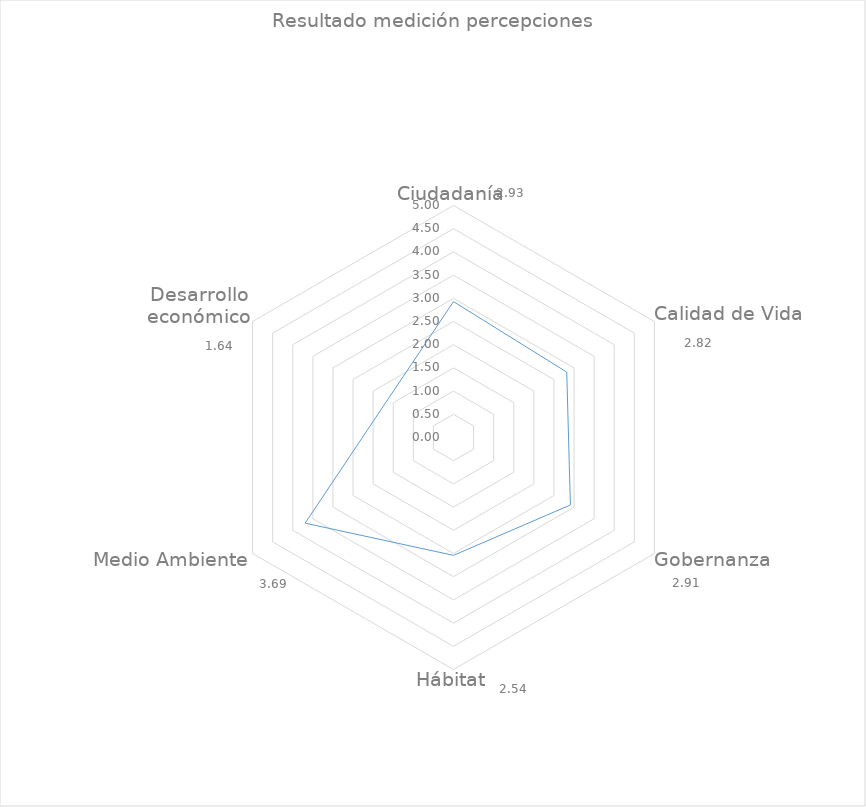
| Category | Series 0 |
|---|---|
| Ciudadanía | 2.929 |
| Calidad de Vida | 2.818 |
| Gobernanza | 2.909 |
| Hábitat | 2.54 |
| Medio Ambiente | 3.692 |
| Desarrollo económico | 1.636 |